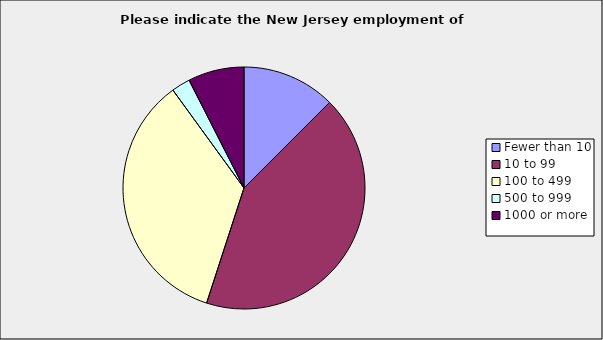
| Category | Series 0 |
|---|---|
| Fewer than 10 | 0.125 |
| 10 to 99 | 0.425 |
| 100 to 499 | 0.35 |
| 500 to 999 | 0.025 |
| 1000 or more | 0.075 |